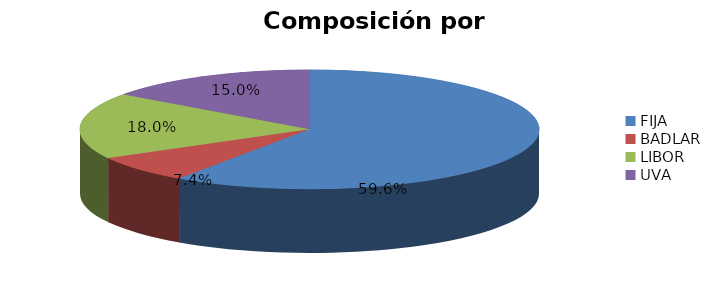
| Category | % |
|---|---|
| FIJA | 0.596 |
| BADLAR | 0.074 |
| LIBOR | 0.18 |
| UVA | 0.15 |